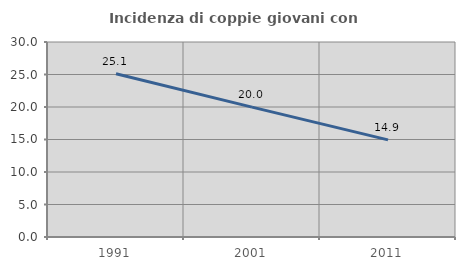
| Category | Incidenza di coppie giovani con figli |
|---|---|
| 1991.0 | 25.104 |
| 2001.0 | 19.977 |
| 2011.0 | 14.943 |